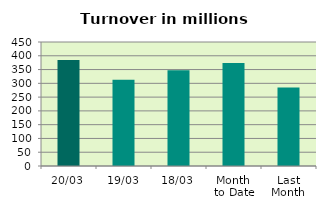
| Category | Series 0 |
|---|---|
| 20/03 | 384.607 |
| 19/03 | 313.34 |
| 18/03 | 347.645 |
| Month 
to Date | 373.573 |
| Last
Month | 285.08 |